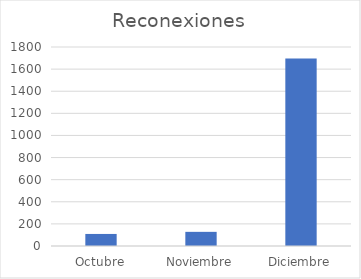
| Category | Reconexiones |
|---|---|
| Octubre | 109 |
| Noviembre | 128 |
| Diciembre | 1695 |